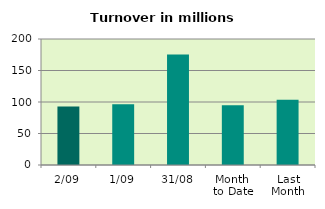
| Category | Series 0 |
|---|---|
| 2/09 | 93.021 |
| 1/09 | 96.45 |
| 31/08 | 175.405 |
| Month 
to Date | 94.736 |
| Last
Month | 103.765 |